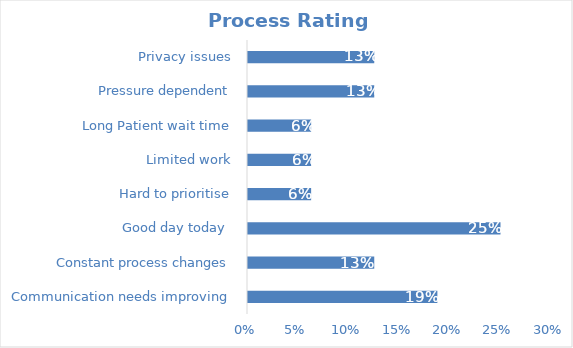
| Category | Series 0 |
|---|---|
| Communication needs improving | 0.188 |
| Constant process changes | 0.125 |
| Good day today  | 0.25 |
| Hard to prioritise | 0.062 |
| Limited work | 0.062 |
| Long Patient wait time | 0.062 |
| Pressure dependent | 0.125 |
| Privacy issues | 0.125 |